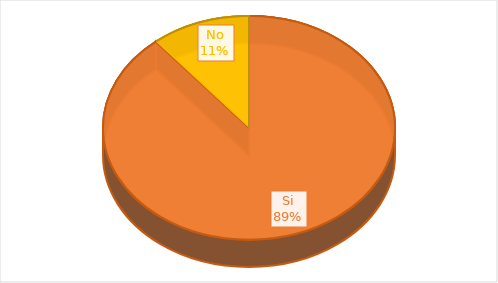
| Category | Series 0 |
|---|---|
| Si | 89 |
| No | 11 |